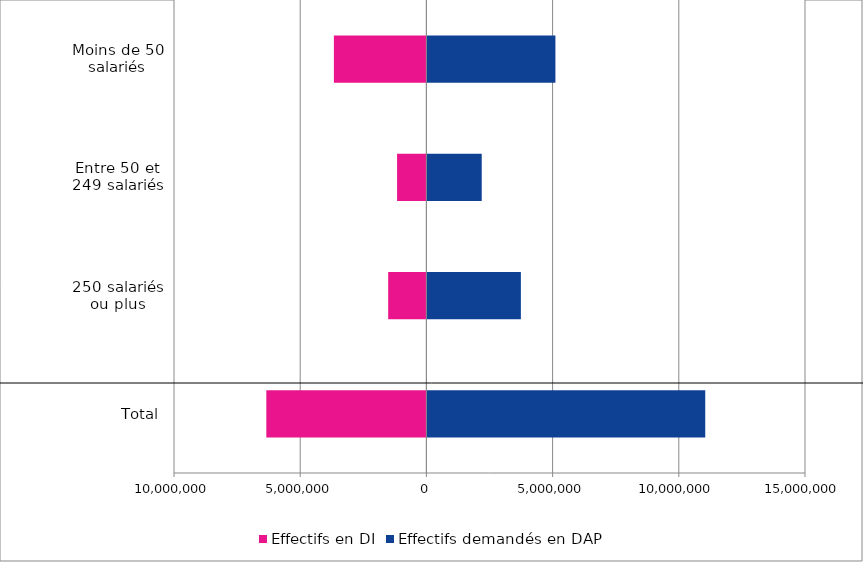
| Category | Effectifs en DI | Effectifs demandés en DAP |
|---|---|---|
| Total | -6341810 | 11047635 |
| 250 salariés ou plus | -1514678 | 3743513 |
| Entre 50 et 249 salariés | -1161931 | 2192413 |
| Moins de 50 salariés | -3665201 | 5111709 |